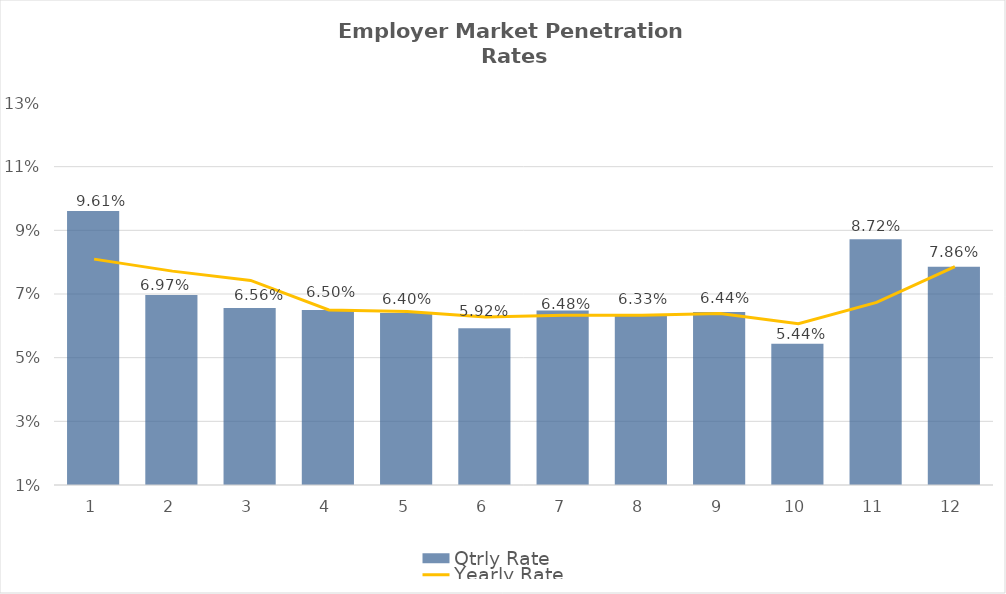
| Category | Qtrly Rate |
|---|---|
| 0 | 0.096 |
| 1 | 0.07 |
| 2 | 0.066 |
| 3 | 0.065 |
| 4 | 0.064 |
| 5 | 0.059 |
| 6 | 0.065 |
| 7 | 0.063 |
| 8 | 0.064 |
| 9 | 0.054 |
| 10 | 0.087 |
| 11 | 0.079 |